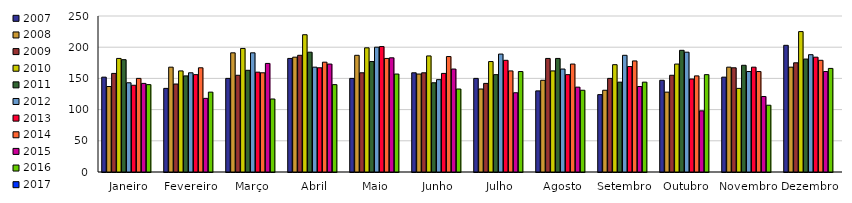
| Category | 2007 | 2008 | 2009 | 2010 | 2011 | 2012 | 2013 | 2014 | 2015 | 2016 | 2017 |
|---|---|---|---|---|---|---|---|---|---|---|---|
| Janeiro | 152 | 137 | 158 | 182 | 180 | 143 | 139 | 150 | 142 | 140 |  |
| Fevereiro | 134 | 168 | 141 | 162 | 154 | 159 | 156 | 167 | 118 | 128 |  |
| Março | 150 | 191 | 155 | 198 | 163 | 191 | 160 | 159 | 174 | 117 |  |
| Abril | 182 | 184 | 187 | 220 | 192 | 168 | 167 | 176 | 173 | 140 |  |
| Maio | 150 | 187 | 159 | 199 | 177 | 200 | 201 | 182 | 183 | 157 |  |
| Junho | 159 | 157 | 159 | 186 | 143 | 148 | 158 | 185 | 165 | 133 |  |
| Julho | 150 | 133 | 142 | 177 | 156 | 189 | 179 | 162 | 127 | 161 |  |
| Agosto | 130 | 147 | 182 | 162 | 182 | 165 | 156 | 173 | 136 | 131 |  |
| Setembro | 124 | 131 | 150 | 172 | 144 | 187 | 169 | 178 | 137 | 144 |  |
| Outubro | 147 | 128 | 155 | 173 | 195 | 192 | 149 | 154 | 98 | 156 |  |
| Novembro | 152 | 168 | 167 | 134 | 171 | 161 | 168 | 161 | 121 | 107 |  |
| Dezembro | 203 | 168 | 175 | 225 | 181 | 188 | 184 | 179 | 161 | 166 |  |